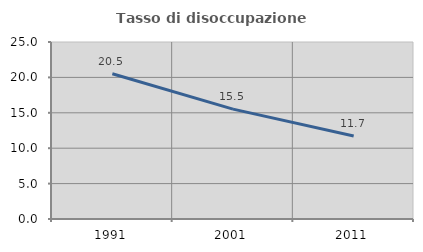
| Category | Tasso di disoccupazione giovanile  |
|---|---|
| 1991.0 | 20.521 |
| 2001.0 | 15.517 |
| 2011.0 | 11.728 |